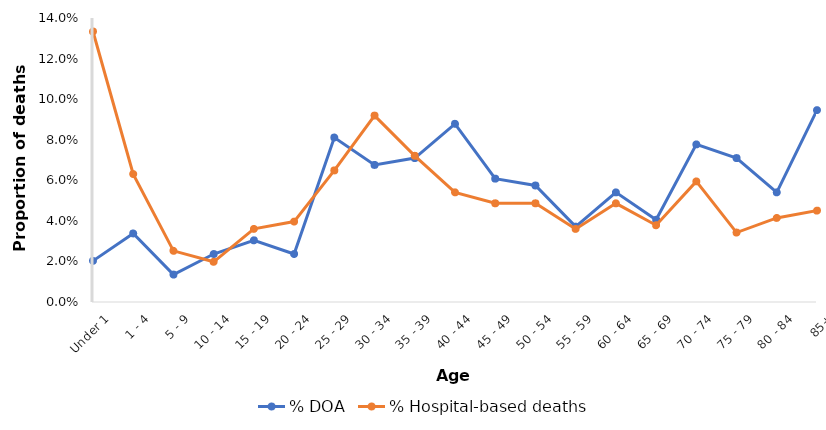
| Category | % DOA | % Hospital-based deaths |
|---|---|---|
| Under 1 | 0.02 | 0.133 |
| 1 - 4 | 0.034 | 0.063 |
| 5 - 9 | 0.014 | 0.025 |
| 10 - 14 | 0.024 | 0.02 |
| 15 - 19 | 0.03 | 0.036 |
| 20 - 24 | 0.024 | 0.04 |
| 25 - 29 | 0.081 | 0.065 |
| 30 - 34 | 0.068 | 0.092 |
| 35 - 39 | 0.071 | 0.072 |
| 40 - 44 | 0.088 | 0.054 |
| 45 - 49 | 0.061 | 0.049 |
| 50 - 54 | 0.057 | 0.049 |
| 55 - 59 | 0.037 | 0.036 |
| 60 - 64 | 0.054 | 0.049 |
| 65 - 69 | 0.041 | 0.038 |
| 70 - 74 | 0.078 | 0.059 |
| 75 - 79 | 0.071 | 0.034 |
| 80 - 84 | 0.054 | 0.041 |
| 85+ | 0.095 | 0.045 |